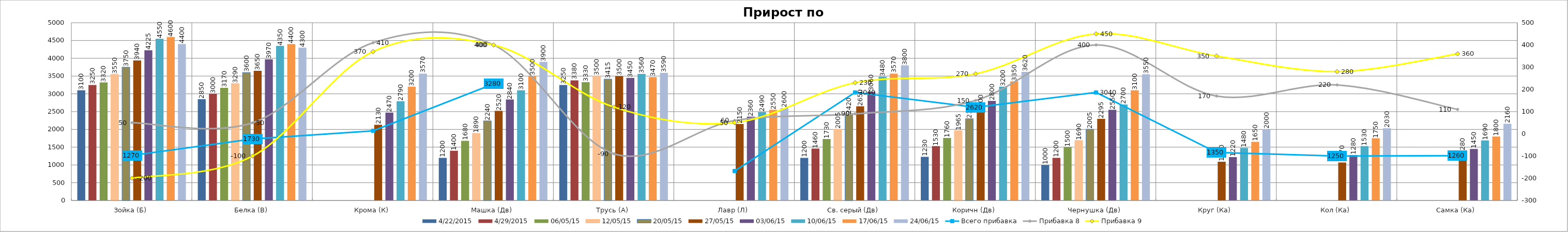
| Category | 22.04.2015 | 29.04.2015 | 06.05.15 | 12.05.15 | 20.05.15 | 27.05.15 | 03.06.15 | 10.06.15 | 17.06.15 | 24.06.15 |
|---|---|---|---|---|---|---|---|---|---|---|
| Зойка (Б) | 3100 | 3250 | 3320 | 3550 | 3750 | 3940 | 4225 | 4550 | 4600 | 4400 |
| Белка (В) | 2850 | 3000 | 3170 | 3290 | 3600 | 3650 | 3970 | 4350 | 4400 | 4300 |
| Крома (К) | 0 | 0 | 0 | 0 | 0 | 2130 | 2470 | 2790 | 3200 | 3570 |
| Машка (Дв) | 1200 | 1400 | 1680 | 1890 | 2240 | 2520 | 2840 | 3100 | 3500 | 3900 |
| Трусь (А) | 3250 | 3380 | 3330 | 3500 | 3415 | 3500 | 3450 | 3560 | 3470 | 3590 |
| Лавр (Л) | 0 | 0 | 0 | 0 | 0 | 2150 | 2360 | 2490 | 2550 | 2600 |
| Св. серый (Дв) | 1200 | 1460 | 1730 | 2005 | 2420 | 2650 | 3060 | 3480 | 3570 | 3800 |
| Коричн (Дв) | 1230 | 1530 | 1760 | 1965 | 2300 | 2500 | 2800 | 3200 | 3350 | 3620 |
| Чернушка (Дв) | 1000 | 1200 | 1500 | 1690 | 2005 | 2295 | 2550 | 2700 | 3100 | 3550 |
| Круг (Ка) | 0 | 0 | 0 | 0 | 0 | 1090 | 1220 | 1480 | 1650 | 2000 |
| Кол (Ка) | 0 | 0 | 0 | 0 | 0 | 1070 | 1280 | 1530 | 1750 | 2030 |
| Самка (Ка) | 0 | 0 | 0 | 0 | 0 | 1280 | 1450 | 1690 | 1800 | 2160 |